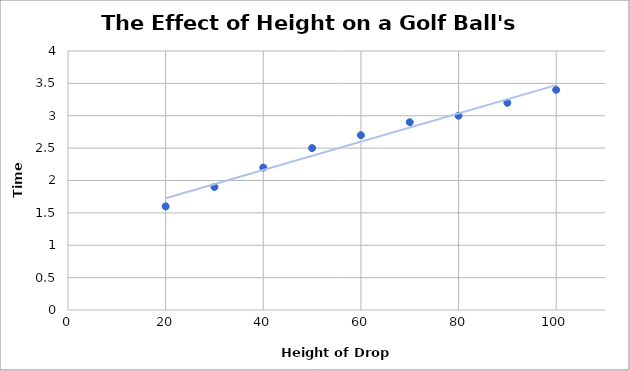
| Category | Series 0 |
|---|---|
| 20.0 | 1.6 |
| 30.0 | 1.9 |
| 40.0 | 2.2 |
| 50.0 | 2.5 |
| 60.0 | 2.7 |
| 70.0 | 2.9 |
| 80.0 | 3 |
| 90.0 | 3.2 |
| 100.0 | 3.4 |